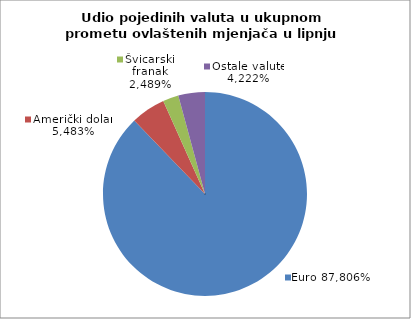
| Category | EUR |
|---|---|
| 0 | 0.878 |
| 1 | 0.055 |
| 2 | 0.025 |
| 3 | 0.042 |